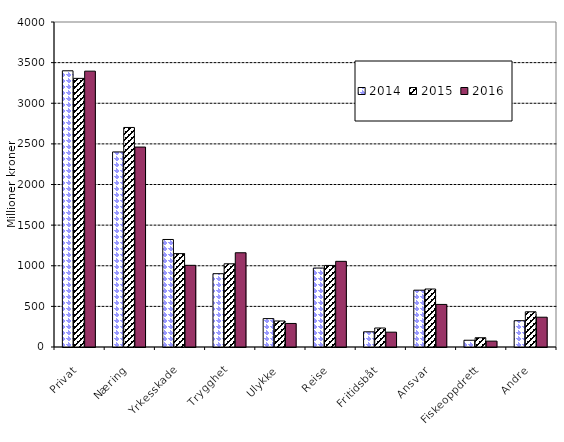
| Category | 2014 | 2015 | 2016 |
|---|---|---|---|
| Privat | 3399.607 | 3306.181 | 3395.008 |
| Næring | 2400.952 | 2701.946 | 2460.812 |
| Yrkesskade | 1323.374 | 1149.454 | 1005.194 |
| Trygghet | 902.33 | 1024.114 | 1159.859 |
| Ulykke | 349.449 | 320.227 | 289.644 |
| Reise | 971.58 | 1003.721 | 1054.352 |
| Fritidsbåt | 187.189 | 233.83 | 182.688 |
| Ansvar | 699.335 | 713.799 | 523.92 |
| Fiskeoppdrett | 83.202 | 114.061 | 72.478 |
| Andre | 323.662 | 433.39 | 366.614 |